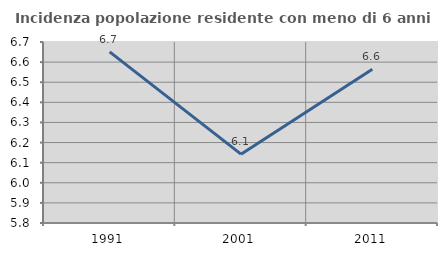
| Category | Incidenza popolazione residente con meno di 6 anni |
|---|---|
| 1991.0 | 6.651 |
| 2001.0 | 6.142 |
| 2011.0 | 6.565 |